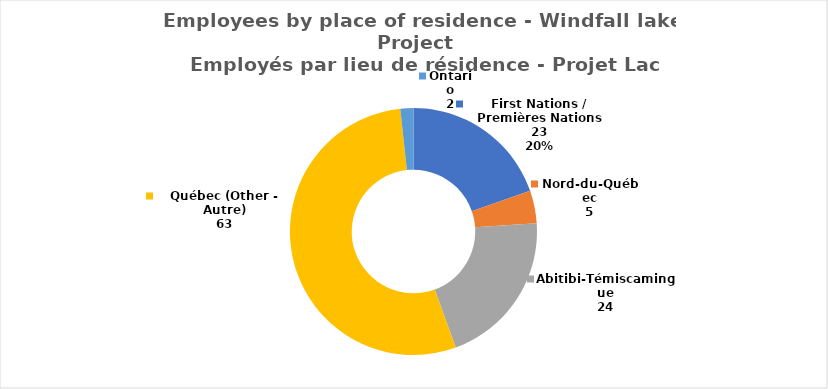
| Category | Series 0 |
|---|---|
| First Nations / Premières Nations | 23 |
| Nord-du-Québec | 5 |
| Abitibi-Témiscamingue | 24 |
| Québec (Other - Autre) | 63 |
| Ontario | 2 |